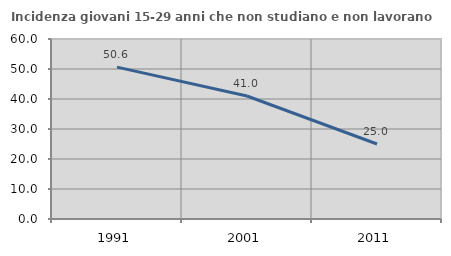
| Category | Incidenza giovani 15-29 anni che non studiano e non lavorano  |
|---|---|
| 1991.0 | 50.617 |
| 2001.0 | 41 |
| 2011.0 | 25 |